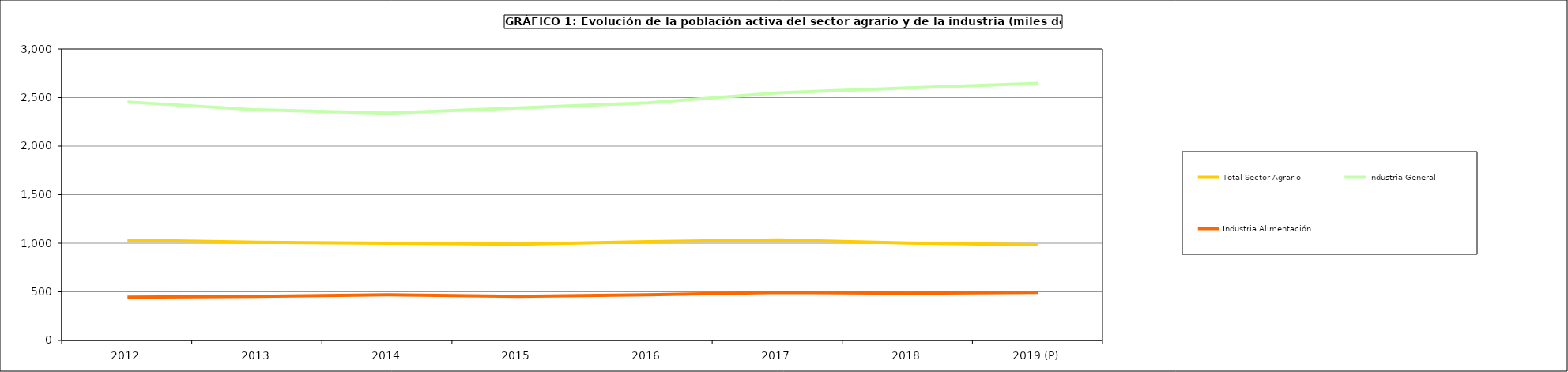
| Category | Total Sector Agrario | Industria General | Industria Alimentación |
|---|---|---|---|
| 2012 | 1032.125 | 2454.25 | 445.725 |
| 2013 | 1010.5 | 2372.975 | 454.075 |
| 2014 | 1000.9 | 2339.7 | 468.5 |
| 2015 | 990.325 | 2391.725 | 454.1 |
| 2016 | 1016.75 | 2445.73 | 468.93 |
| 2017 | 1034 | 2548.2 | 494.3 |
| 2018 | 1002.675 | 2599.175 | 485.3 |
| 2019 (P) | 983.3 | 2646.575 | 493.625 |